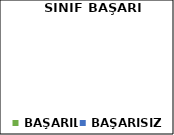
| Category | Series 0 |
|---|---|
| BAŞARILI | 0 |
| BAŞARISIZ | 0 |